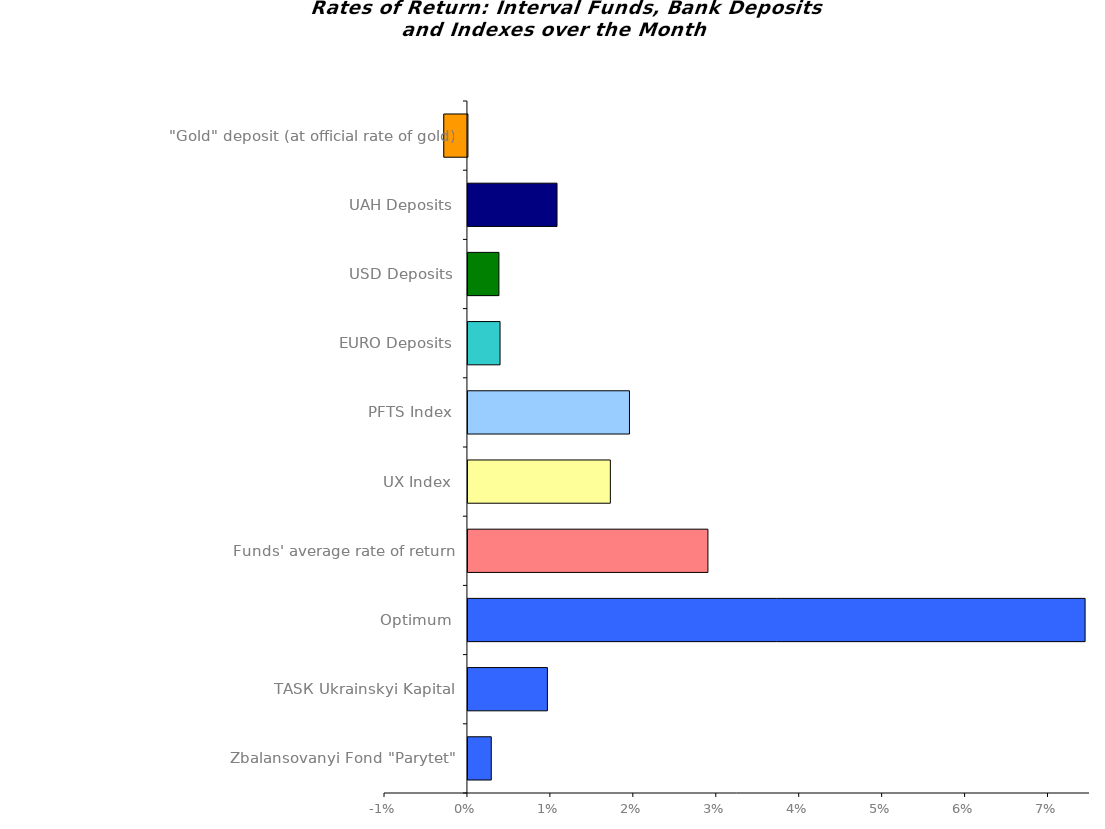
| Category | Series 0 |
|---|---|
| Zbalansovanyi Fond "Parytet" | 0.003 |
| ТАSК Ukrainskyi Kapital | 0.01 |
| Optimum | 0.074 |
| Funds' average rate of return | 0.029 |
| UX Index | 0.017 |
| PFTS Index | 0.019 |
| EURO Deposits | 0.004 |
| USD Deposits | 0.004 |
| UAH Deposits | 0.011 |
| "Gold" deposit (at official rate of gold) | -0.003 |